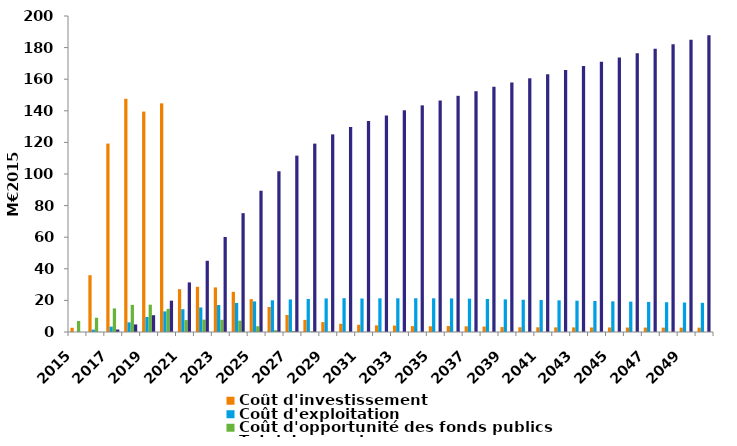
| Category | Coût d'investissement | Coût d'exploitation | Coût d'opportunité des fonds publics | Total des surplus |
|---|---|---|---|---|
| 2015.0 | 2.671 | 0 | 6.955 | 0 |
| 2016.0 | 35.945 | 1.491 | 9.022 | 0.064 |
| 2017.0 | 119.241 | 3.395 | 14.925 | 1.566 |
| 2018.0 | 147.588 | 6.097 | 17.159 | 4.799 |
| 2019.0 | 139.498 | 9.494 | 17.28 | 10.626 |
| 2020.0 | 144.713 | 13.046 | 14.652 | 19.846 |
| 2021.0 | 27.107 | 14.411 | 7.546 | 31.374 |
| 2022.0 | 28.611 | 15.535 | 7.818 | 45.073 |
| 2023.0 | 28.228 | 17.069 | 7.722 | 60.112 |
| 2024.0 | 25.431 | 18.406 | 7.152 | 75.205 |
| 2025.0 | 20.812 | 19.362 | 3.637 | 89.402 |
| 2026.0 | 15.839 | 20.069 | 1.094 | 101.736 |
| 2027.0 | 10.775 | 20.609 | 0.676 | 111.625 |
| 2028.0 | 7.665 | 20.899 | 0.419 | 119.226 |
| 2029.0 | 6.257 | 21.239 | 0.305 | 125.088 |
| 2030.0 | 5.215 | 21.408 | 0.22 | 129.69 |
| 2031.0 | 4.568 | 21.196 | 0.168 | 133.56 |
| 2032.0 | 4.201 | 21.301 | 0.14 | 137.045 |
| 2033.0 | 4.061 | 21.353 | 0.13 | 140.327 |
| 2034.0 | 3.75 | 21.359 | 0.107 | 143.448 |
| 2035.0 | 3.635 | 21.335 | 0.099 | 146.51 |
| 2036.0 | 3.776 | 21.249 | 0.079 | 149.486 |
| 2037.0 | 3.602 | 21.089 | 0.067 | 152.387 |
| 2038.0 | 3.428 | 20.896 | 0.055 | 155.223 |
| 2039.0 | 3.125 | 20.657 | 0.032 | 157.932 |
| 2040.0 | 3.009 | 20.421 | 0.025 | 160.569 |
| 2041.0 | 2.98 | 20.246 | 0.024 | 163.172 |
| 2042.0 | 2.95 | 20.034 | 0.024 | 165.762 |
| 2043.0 | 2.921 | 19.825 | 0.024 | 168.378 |
| 2044.0 | 2.892 | 19.619 | 0.024 | 171.036 |
| 2045.0 | 2.863 | 19.417 | 0.024 | 173.735 |
| 2046.0 | 2.835 | 19.224 | 0.023 | 176.477 |
| 2047.0 | 2.807 | 19.034 | 0.023 | 179.262 |
| 2048.0 | 2.779 | 18.846 | 0.023 | 182.091 |
| 2049.0 | 2.752 | 18.659 | 0.023 | 184.965 |
| 2050.0 | 2.724 | 18.474 | 0.022 | 187.883 |